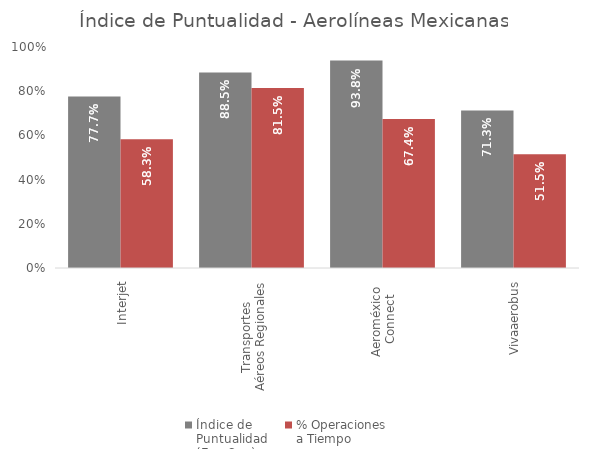
| Category | Índice de 
Puntualidad
(Ene-Sep) | % Operaciones 
a Tiempo |
|---|---|---|
| Interjet | 0.777 | 0.583 |
| Transportes 
Aéreos Regionales | 0.885 | 0.815 |
| Aeroméxico 
Connect | 0.938 | 0.674 |
| Vivaaerobus | 0.713 | 0.515 |